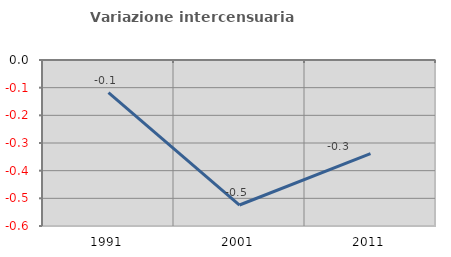
| Category | Variazione intercensuaria annua |
|---|---|
| 1991.0 | -0.118 |
| 2001.0 | -0.524 |
| 2011.0 | -0.338 |